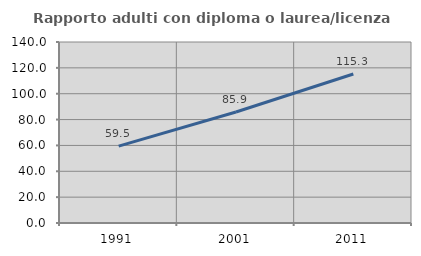
| Category | Rapporto adulti con diploma o laurea/licenza media  |
|---|---|
| 1991.0 | 59.507 |
| 2001.0 | 85.891 |
| 2011.0 | 115.269 |